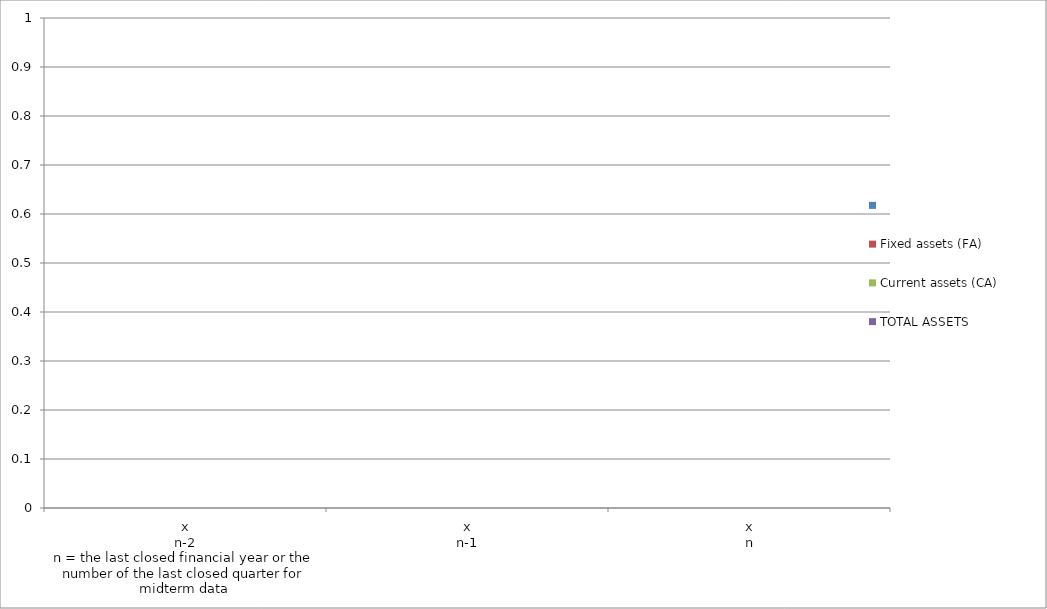
| Category | Series 0 | Fixed assets (FA) | Current assets (CA) | TOTAL ASSETS |
|---|---|---|---|---|
| 0 |  |  |  | 0 |
| 1 |  |  |  | 0 |
| 2 |  |  |  | 0 |